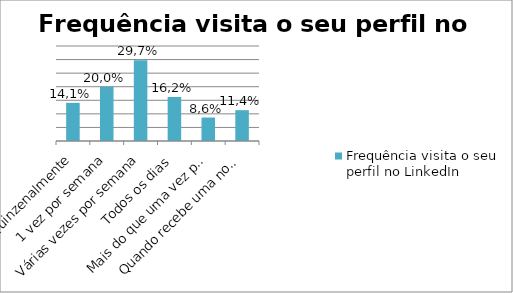
| Category | Frequência visita o seu perfil no LinkedIn |
|---|---|
| Quinzenalmente | 14.054 |
| 1 vez por semana | 20 |
| Várias vezes por semana | 29.73 |
| Todos os dias | 16.216 |
| Mais do que uma vez por dia | 8.649 |
| Quando recebe uma notificação | 11.351 |